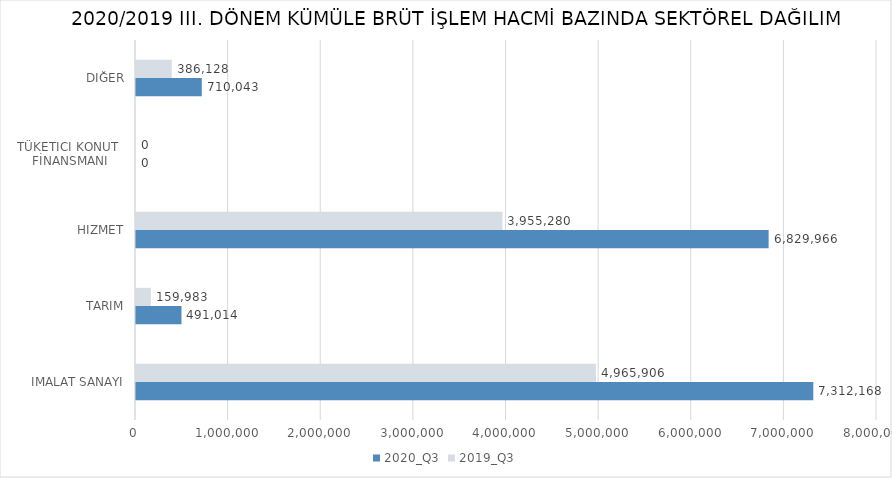
| Category | 2020_Q3 | 2019_Q3 |
|---|---|---|
| İMALAT SANAYİ | 7312168.18 | 4965905.816 |
| TARIM | 491013.571 | 159982.93 |
| HİZMET | 6829966.082 | 3955280.16 |
| TÜKETİCİ KONUT 
FİNANSMANI | 0 | 0 |
| DİĞER | 710043.38 | 386128.15 |